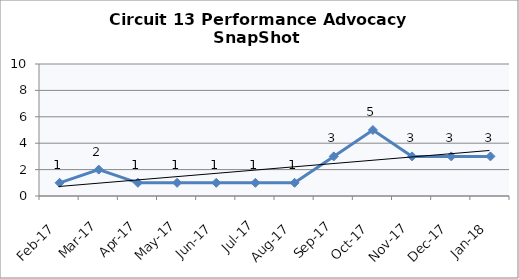
| Category | Circuit 13 |
|---|---|
| Feb-17 | 1 |
| Mar-17 | 2 |
| Apr-17 | 1 |
| May-17 | 1 |
| Jun-17 | 1 |
| Jul-17 | 1 |
| Aug-17 | 1 |
| Sep-17 | 3 |
| Oct-17 | 5 |
| Nov-17 | 3 |
| Dec-17 | 3 |
| Jan-18 | 3 |